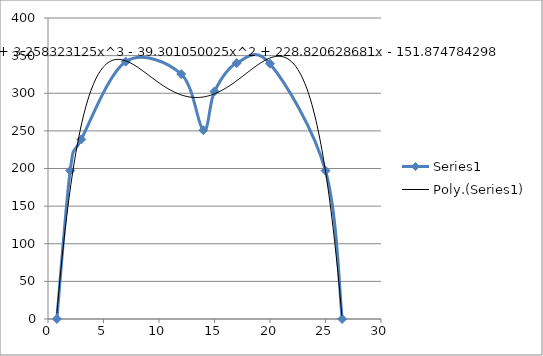
| Category | Series 0 |
|---|---|
| 0.8 | 0 |
| 2.0 | 197.125 |
| 3.0 | 238.625 |
| 7.0 | 342 |
| 12.0 | 325.5 |
| 14.0 | 250.88 |
| 15.0 | 302.375 |
| 17.0 | 340 |
| 20.0 | 339.205 |
| 25.0 | 197.125 |
| 26.5 | 0 |